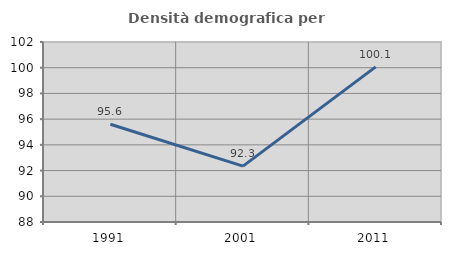
| Category | Densità demografica |
|---|---|
| 1991.0 | 95.607 |
| 2001.0 | 92.343 |
| 2011.0 | 100.064 |